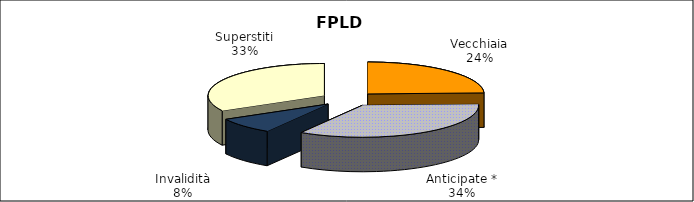
| Category | Series 0 |
|---|---|
| Vecchiaia | 84570 |
| Anticipate * | 118512 |
| Invalidità | 28628 |
| Superstiti | 113765 |